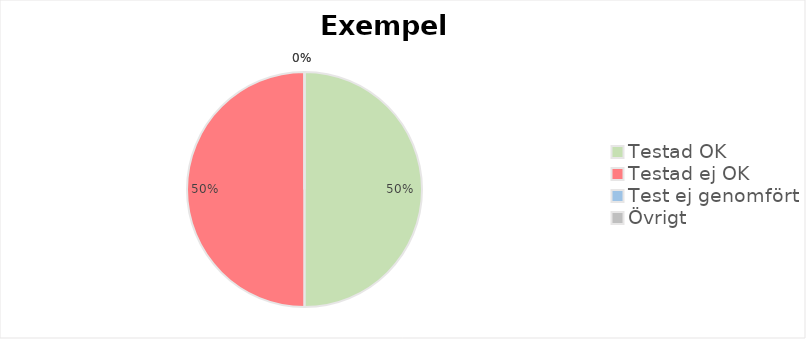
| Category | Series 0 |
|---|---|
| Testad OK | 1 |
| Testad ej OK | 1 |
| Test ej genomfört | 0 |
| Övrigt | 0 |